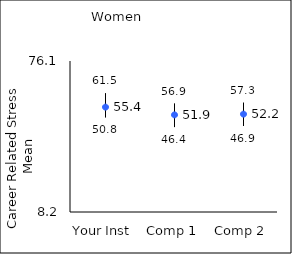
| Category | 25th percentile | 75th percentile | Mean |
|---|---|---|---|
| Your Inst | 50.8 | 61.5 | 55.36 |
| Comp 1 | 46.4 | 56.9 | 51.88 |
| Comp 2 | 46.9 | 57.3 | 52.21 |